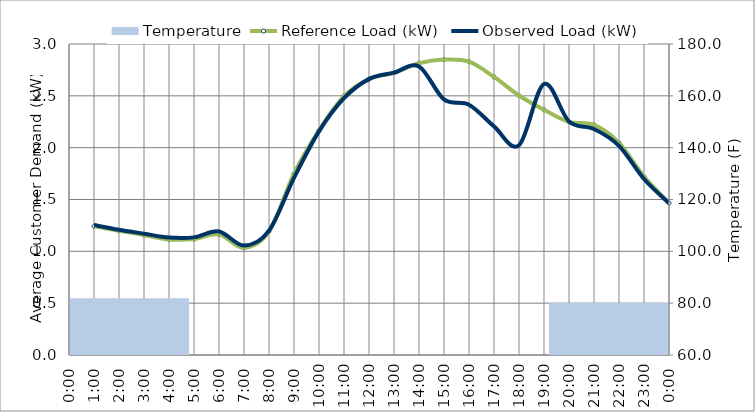
| Category | Temperature |
|---|---|
| 0 | 81.933 |
| 1900-01-01 | 80.1 |
| 1900-01-02 | 78.4 |
| 1900-01-03 | 76.767 |
| 1900-01-04 | 75.067 |
| 1900-01-05 | 73.767 |
| 1900-01-06 | 73.667 |
| 1900-01-07 | 76.2 |
| 1900-01-08 | 80.933 |
| 1900-01-09 | 85.133 |
| 1900-01-10 | 88.733 |
| 1900-01-11 | 91.933 |
| 1900-01-12 | 94.5 |
| 1900-01-13 | 96.7 |
| 1900-01-14 | 98.233 |
| 1900-01-15 | 99.033 |
| 1900-01-16 | 99.833 |
| 1900-01-17 | 100.033 |
| 1900-01-18 | 99.233 |
| 1900-01-19 | 96.7 |
| 1900-01-20 | 93.367 |
| 1900-01-21 | 90.5 |
| 1900-01-22 | 87.533 |
| 1900-01-23 | 84.933 |